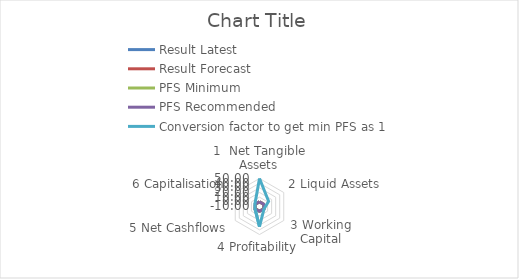
| Category | Result Latest | Result Forecast | PFS Minimum | PFS Recommended | Conversion factor to get min PFS as 1 |
|---|---|---|---|---|---|
| 1  Net Tangible Assets | 0 | 0 | 0.02 | 0.02 | 50 |
| 2 Liquid Assets | 0 | 0 | 0.05 | 0.08 | 12.5 |
| 3 Working Capital | 0 | 0 | 0.75 | 1 | 1 |
| 4 Profitability | 0 | 0 | -0.08 | 0.03 | 33.333 |
| 5 Net Cashflows | 0 | 0 | 1 | 1.11 | 0.901 |
| 6 Capitalisation | 0 | 0 | 0.5 | 0.76 | 1.316 |